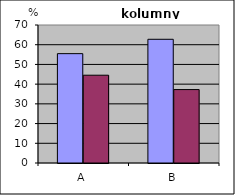
| Category | Series 0 | Series 1 |
|---|---|---|
| A | 55.469 | 44.531 |
| B | 62.755 | 37.245 |